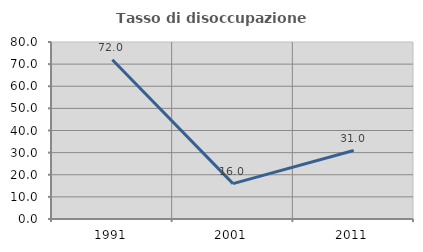
| Category | Tasso di disoccupazione giovanile  |
|---|---|
| 1991.0 | 72 |
| 2001.0 | 16 |
| 2011.0 | 30.952 |